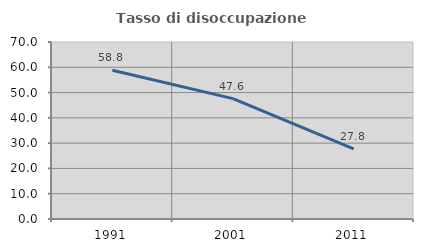
| Category | Tasso di disoccupazione giovanile  |
|---|---|
| 1991.0 | 58.824 |
| 2001.0 | 47.619 |
| 2011.0 | 27.778 |